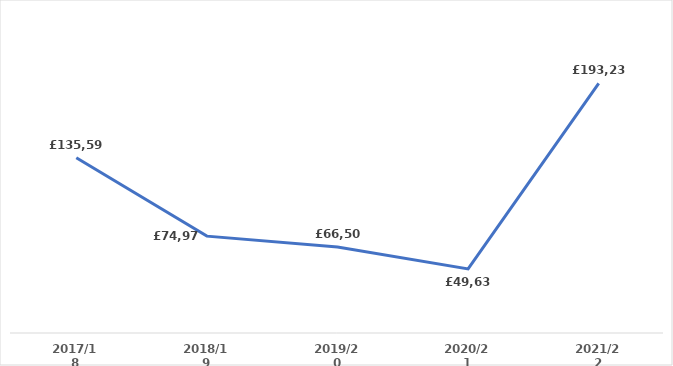
| Category | Series 0 |
|---|---|
| 2017/18 | 135593 |
| 2018/19 | 74977 |
| 2019/20 | 66506.53 |
| 2020/21 | 49635.93 |
| 2021/22 | 193230.58 |